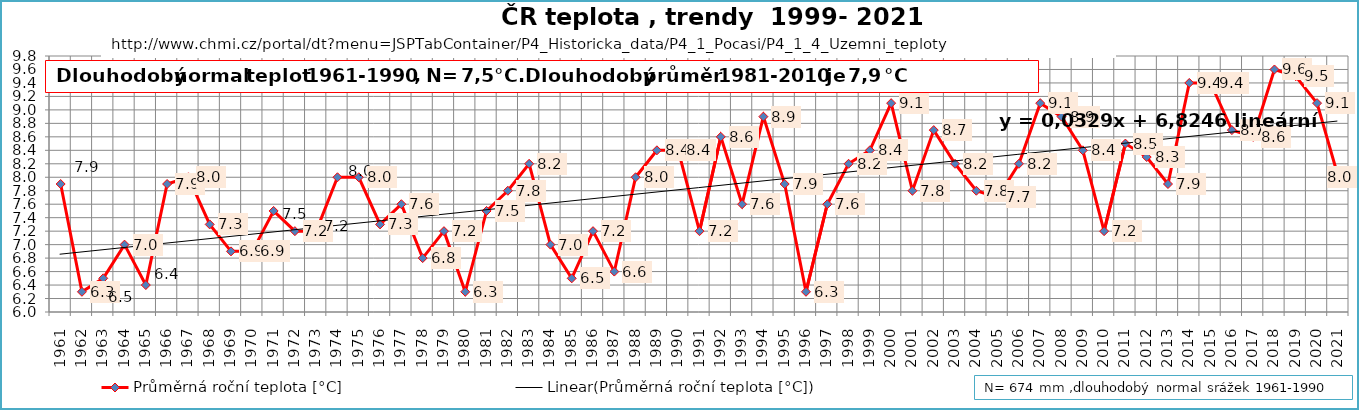
| Category | Průměrná roční teplota [°C] |
|---|---|
| 1961.0 | 7.9 |
| 1962.0 | 6.3 |
| 1963.0 | 6.5 |
| 1964.0 | 7 |
| 1965.0 | 6.4 |
| 1966.0 | 7.9 |
| 1967.0 | 8 |
| 1968.0 | 7.3 |
| 1969.0 | 6.9 |
| 1970.0 | 6.9 |
| 1971.0 | 7.5 |
| 1972.0 | 7.2 |
| 1973.0 | 7.2 |
| 1974.0 | 8 |
| 1975.0 | 8 |
| 1976.0 | 7.3 |
| 1977.0 | 7.6 |
| 1978.0 | 6.8 |
| 1979.0 | 7.2 |
| 1980.0 | 6.3 |
| 1981.0 | 7.5 |
| 1982.0 | 7.8 |
| 1983.0 | 8.2 |
| 1984.0 | 7 |
| 1985.0 | 6.5 |
| 1986.0 | 7.2 |
| 1987.0 | 6.6 |
| 1988.0 | 8 |
| 1989.0 | 8.4 |
| 1990.0 | 8.4 |
| 1991.0 | 7.2 |
| 1992.0 | 8.6 |
| 1993.0 | 7.6 |
| 1994.0 | 8.9 |
| 1995.0 | 7.9 |
| 1996.0 | 6.3 |
| 1997.0 | 7.6 |
| 1998.0 | 8.2 |
| 1999.0 | 8.4 |
| 2000.0 | 9.1 |
| 2001.0 | 7.8 |
| 2002.0 | 8.7 |
| 2003.0 | 8.2 |
| 2004.0 | 7.8 |
| 2005.0 | 7.7 |
| 2006.0 | 8.2 |
| 2007.0 | 9.1 |
| 2008.0 | 8.9 |
| 2009.0 | 8.4 |
| 2010.0 | 7.2 |
| 2011.0 | 8.5 |
| 2012.0 | 8.3 |
| 2013.0 | 7.9 |
| 2014.0 | 9.4 |
| 2015.0 | 9.4 |
| 2016.0 | 8.7 |
| 2017.0 | 8.6 |
| 2018.0 | 9.6 |
| 2019.0 | 9.5 |
| 2020.0 | 9.1 |
| 2021.0 | 8 |